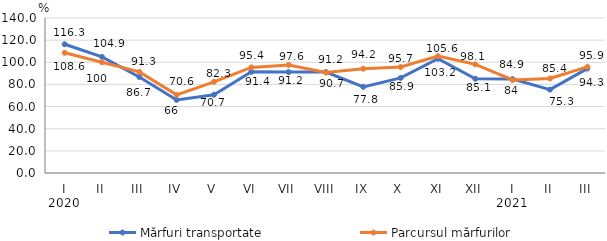
| Category | Mărfuri transportate | Parcursul mărfurilor |
|---|---|---|
| 0 | 116.3 | 108.6 |
| 1 | 104.9 | 100 |
| 2 | 86.7 | 91.3 |
| 3 | 66 | 70.6 |
| 4 | 70.7 | 82.3 |
| 5 | 91.4 | 95.4 |
| 6 | 91.2 | 97.6 |
| 7 | 91.2 | 90.7 |
| 8 | 77.8 | 94.2 |
| 9 | 85.9 | 95.7 |
| 10 | 103.2 | 105.6 |
| 11 | 85.1 | 98.1 |
| 12 | 84.9 | 84 |
| 13 | 75.3 | 85.4 |
| 14 | 94.3 | 95.9 |